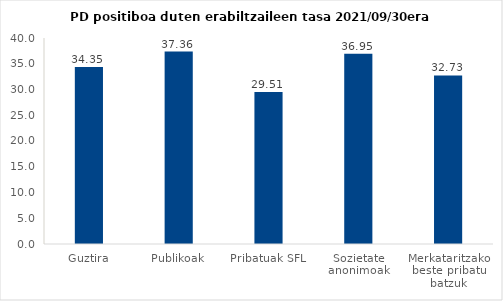
| Category | Series 0 |
|---|---|
| Guztira | 34.355 |
| Publikoak | 37.361 |
| Pribatuak SFL | 29.514 |
| Sozietate anonimoak | 36.954 |
| Merkataritzako beste pribatu batzuk | 32.732 |